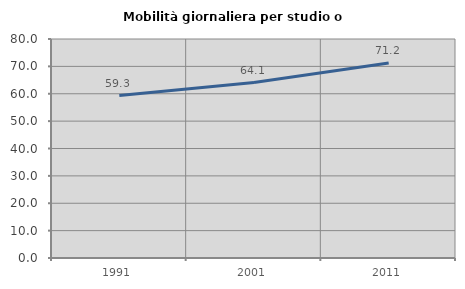
| Category | Mobilità giornaliera per studio o lavoro |
|---|---|
| 1991.0 | 59.338 |
| 2001.0 | 64.083 |
| 2011.0 | 71.211 |